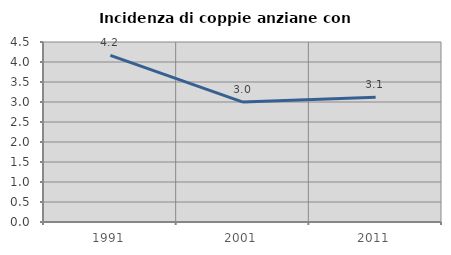
| Category | Incidenza di coppie anziane con figli |
|---|---|
| 1991.0 | 4.167 |
| 2001.0 | 2.999 |
| 2011.0 | 3.117 |